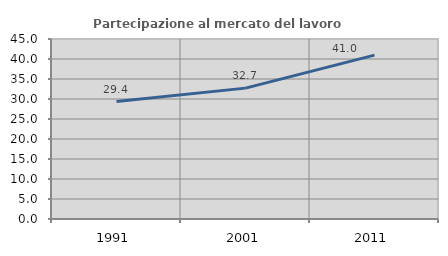
| Category | Partecipazione al mercato del lavoro  femminile |
|---|---|
| 1991.0 | 29.357 |
| 2001.0 | 32.719 |
| 2011.0 | 40.962 |